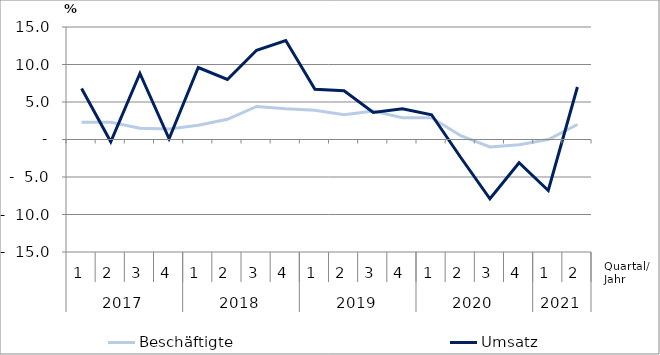
| Category | Beschäftigte | Umsatz |
|---|---|---|
| 0 | 2.3 | 6.8 |
| 1 | 2.3 | -0.3 |
| 2 | 1.5 | 8.8 |
| 3 | 1.4 | 0.1 |
| 4 | 1.9 | 9.6 |
| 5 | 2.7 | 8 |
| 6 | 4.4 | 11.9 |
| 7 | 4.1 | 13.2 |
| 8 | 3.9 | 6.7 |
| 9 | 3.3 | 6.5 |
| 10 | 3.8 | 3.6 |
| 11 | 2.9 | 4.1 |
| 12 | 2.9 | 3.3 |
| 13 | 0.5 | -2.4 |
| 14 | -1 | -7.9 |
| 15 | -0.7 | -3.1 |
| 16 | 0 | -6.8 |
| 17 | 2 | 7 |